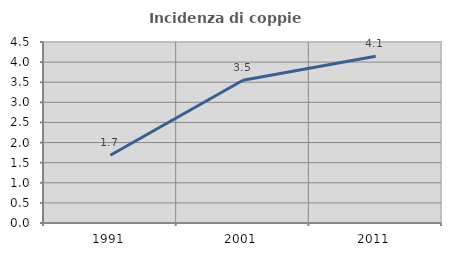
| Category | Incidenza di coppie miste |
|---|---|
| 1991.0 | 1.686 |
| 2001.0 | 3.549 |
| 2011.0 | 4.145 |